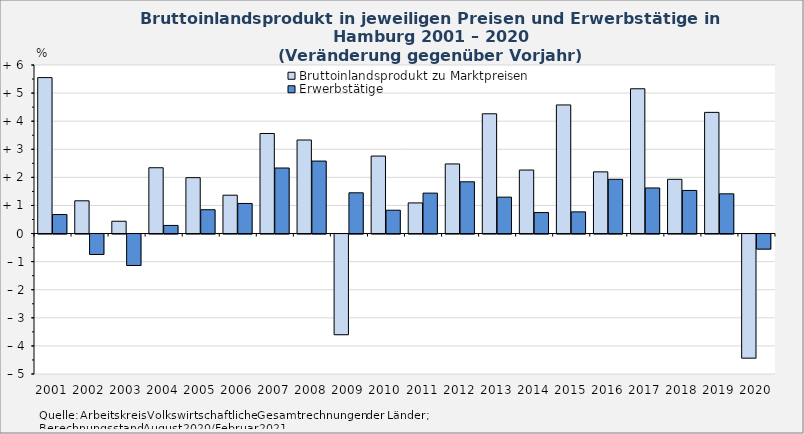
| Category | Bruttoinlandsprodukt zu Marktpreisen | Erwerbstätige |
|---|---|---|
| 2001.0 | 5.551 | 0.677 |
| 2002.0 | 1.166 | -0.727 |
| 2003.0 | 0.438 | -1.119 |
| 2004.0 | 2.342 | 0.289 |
| 2005.0 | 1.989 | 0.848 |
| 2006.0 | 1.365 | 1.071 |
| 2007.0 | 3.562 | 2.333 |
| 2008.0 | 3.33 | 2.58 |
| 2009.0 | -3.584 | 1.45 |
| 2010.0 | 2.759 | 0.83 |
| 2011.0 | 1.09 | 1.439 |
| 2012.0 | 2.478 | 1.843 |
| 2013.0 | 4.263 | 1.296 |
| 2014.0 | 2.261 | 0.747 |
| 2015.0 | 4.578 | 0.772 |
| 2016.0 | 2.196 | 1.931 |
| 2017.0 | 5.154 | 1.623 |
| 2018.0 | 1.931 | 1.534 |
| 2019.0 | 4.314 | 1.414 |
| 2020.0 | -4.418 | -0.536 |